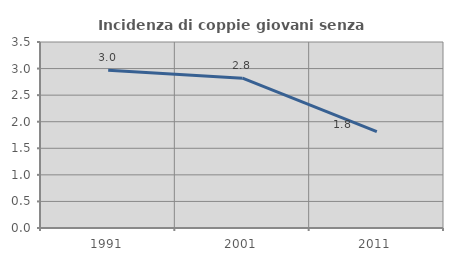
| Category | Incidenza di coppie giovani senza figli |
|---|---|
| 1991.0 | 2.969 |
| 2001.0 | 2.819 |
| 2011.0 | 1.814 |